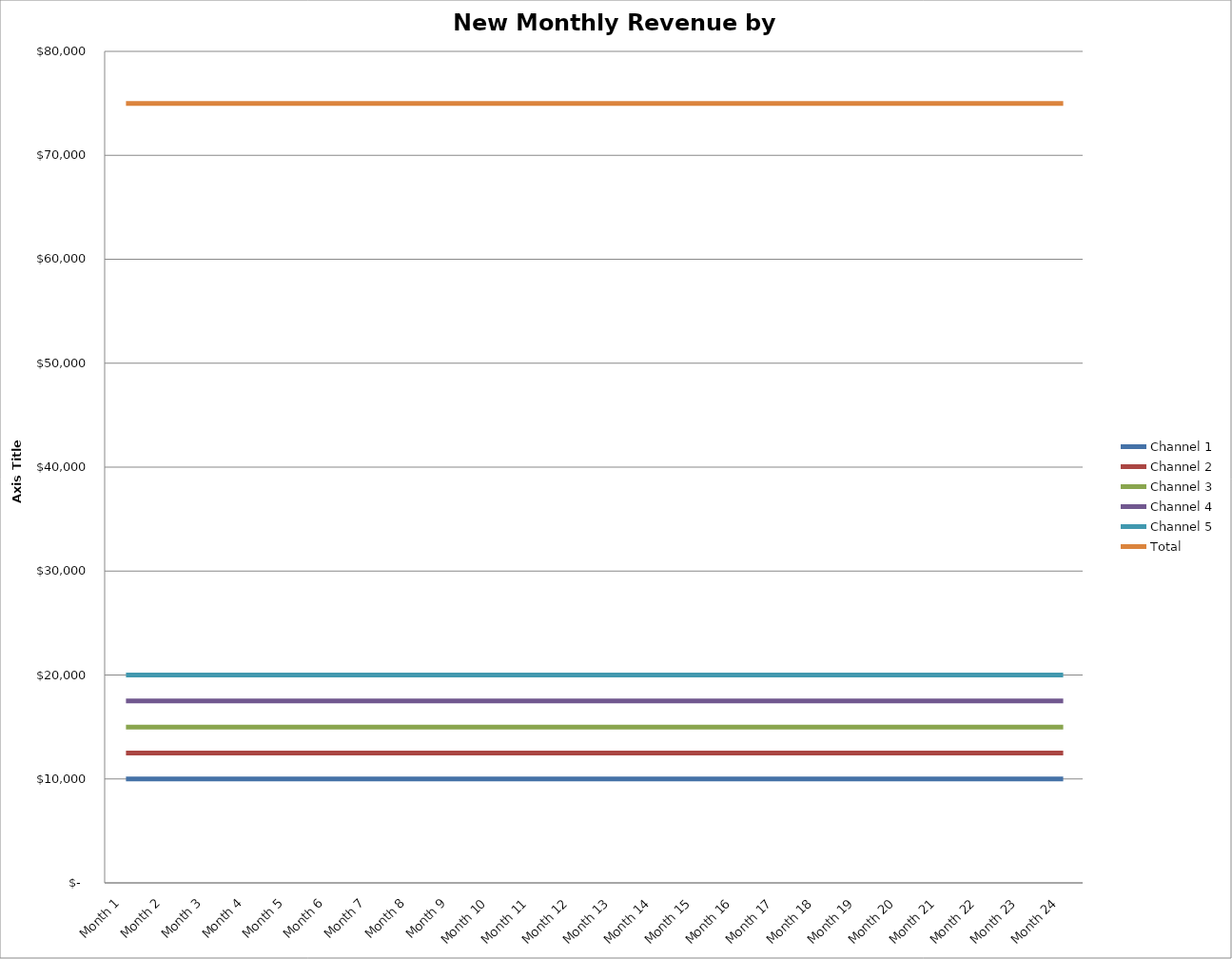
| Category | Channel 1 | Channel 2 | Channel 3 | Channel 4 | Channel 5 | Total |
|---|---|---|---|---|---|---|
| Month 1 | 10000 | 12500 | 15000 | 17500 | 20000 | 75000 |
| Month 2 | 10000 | 12500 | 15000 | 17500 | 20000 | 75000 |
| Month 3 | 10000 | 12500 | 15000 | 17500 | 20000 | 75000 |
| Month 4 | 10000 | 12500 | 15000 | 17500 | 20000 | 75000 |
| Month 5 | 10000 | 12500 | 15000 | 17500 | 20000 | 75000 |
| Month 6 | 10000 | 12500 | 15000 | 17500 | 20000 | 75000 |
| Month 7 | 10000 | 12500 | 15000 | 17500 | 20000 | 75000 |
| Month 8 | 10000 | 12500 | 15000 | 17500 | 20000 | 75000 |
| Month 9 | 10000 | 12500 | 15000 | 17500 | 20000 | 75000 |
| Month 10 | 10000 | 12500 | 15000 | 17500 | 20000 | 75000 |
| Month 11 | 10000 | 12500 | 15000 | 17500 | 20000 | 75000 |
| Month 12 | 10000 | 12500 | 15000 | 17500 | 20000 | 75000 |
| Month 13 | 10000 | 12500 | 15000 | 17500 | 20000 | 75000 |
| Month 14 | 10000 | 12500 | 15000 | 17500 | 20000 | 75000 |
| Month 15 | 10000 | 12500 | 15000 | 17500 | 20000 | 75000 |
| Month 16 | 10000 | 12500 | 15000 | 17500 | 20000 | 75000 |
| Month 17 | 10000 | 12500 | 15000 | 17500 | 20000 | 75000 |
| Month 18 | 10000 | 12500 | 15000 | 17500 | 20000 | 75000 |
| Month 19 | 10000 | 12500 | 15000 | 17500 | 20000 | 75000 |
| Month 20 | 10000 | 12500 | 15000 | 17500 | 20000 | 75000 |
| Month 21 | 10000 | 12500 | 15000 | 17500 | 20000 | 75000 |
| Month 22 | 10000 | 12500 | 15000 | 17500 | 20000 | 75000 |
| Month 23 | 10000 | 12500 | 15000 | 17500 | 20000 | 75000 |
| Month 24 | 10000 | 12500 | 15000 | 17500 | 20000 | 75000 |